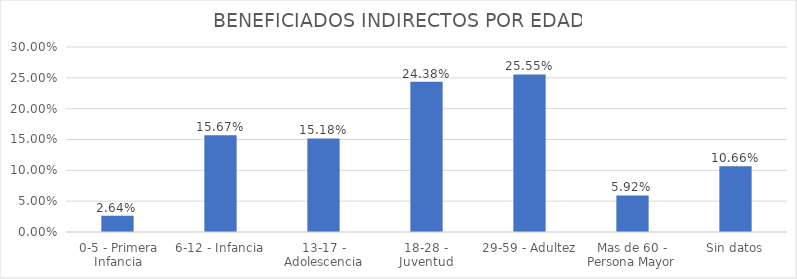
| Category | % |
|---|---|
| 0-5 - Primera Infancia | 0.026 |
| 6-12 - Infancia | 0.157 |
| 13-17 - Adolescencia | 0.152 |
| 18-28 - Juventud | 0.244 |
| 29-59 - Adultez | 0.256 |
| Mas de 60 - Persona Mayor | 0.059 |
| Sin datos | 0.107 |